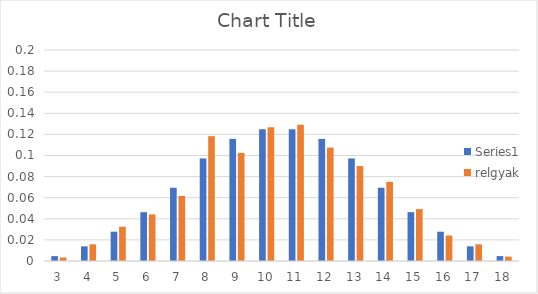
| Category | Series 0 | relgyak |
|---|---|---|
| 3.0 | 0.005 | 0.003 |
| 4.0 | 0.014 | 0.016 |
| 5.0 | 0.028 | 0.032 |
| 6.0 | 0.046 | 0.044 |
| 7.0 | 0.069 | 0.062 |
| 8.0 | 0.097 | 0.118 |
| 9.0 | 0.116 | 0.102 |
| 10.0 | 0.125 | 0.127 |
| 11.0 | 0.125 | 0.129 |
| 12.0 | 0.116 | 0.108 |
| 13.0 | 0.097 | 0.09 |
| 14.0 | 0.069 | 0.075 |
| 15.0 | 0.046 | 0.049 |
| 16.0 | 0.028 | 0.024 |
| 17.0 | 0.014 | 0.016 |
| 18.0 | 0.005 | 0.004 |